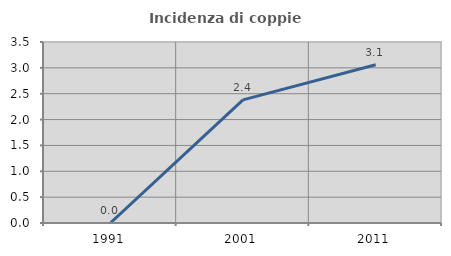
| Category | Incidenza di coppie miste |
|---|---|
| 1991.0 | 0 |
| 2001.0 | 2.381 |
| 2011.0 | 3.061 |